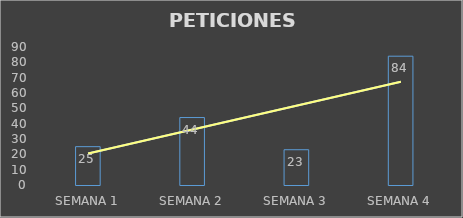
| Category | Series 0 |
|---|---|
| SEMANA 1 | 25 |
| SEMANA 2 | 44 |
| SEMANA 3 | 23 |
| SEMANA 4 | 84 |